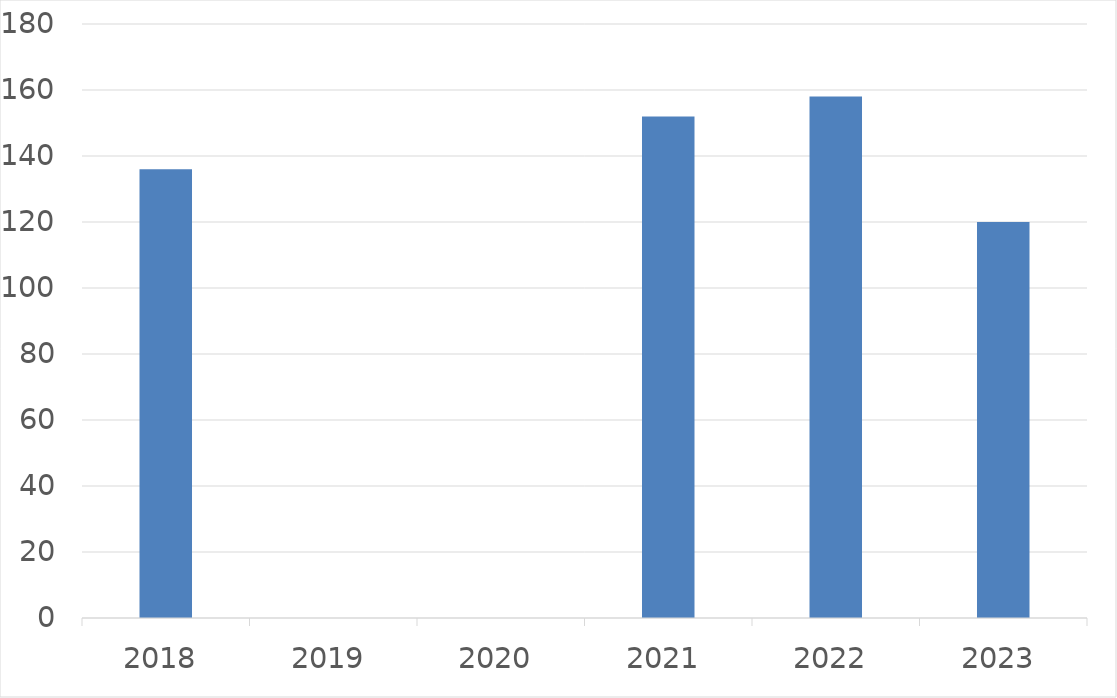
| Category | Series 0 |
|---|---|
| 2018 | 136 |
| 2019 | 0 |
| 2020 | 0 |
| 2021 | 152 |
| 2022 | 158 |
| 2023 | 120 |